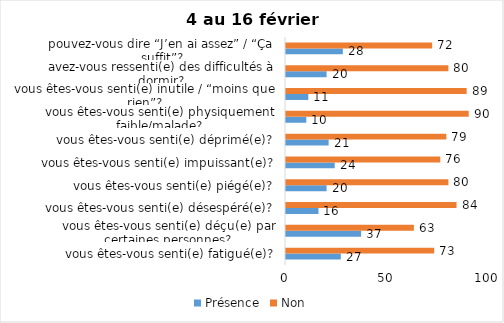
| Category | Présence | Non |
|---|---|---|
| vous êtes-vous senti(e) fatigué(e)? | 27 | 73 |
| vous êtes-vous senti(e) déçu(e) par certaines personnes? | 37 | 63 |
| vous êtes-vous senti(e) désespéré(e)? | 16 | 84 |
| vous êtes-vous senti(e) piégé(e)? | 20 | 80 |
| vous êtes-vous senti(e) impuissant(e)? | 24 | 76 |
| vous êtes-vous senti(e) déprimé(e)? | 21 | 79 |
| vous êtes-vous senti(e) physiquement faible/malade? | 10 | 90 |
| vous êtes-vous senti(e) inutile / “moins que rien”? | 11 | 89 |
| avez-vous ressenti(e) des difficultés à dormir? | 20 | 80 |
| pouvez-vous dire “J’en ai assez” / “Ça suffit”? | 28 | 72 |